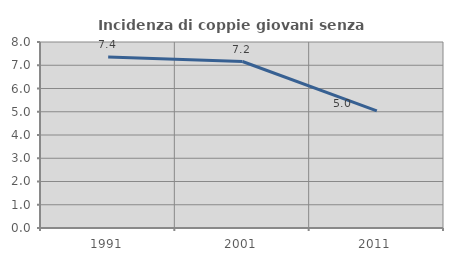
| Category | Incidenza di coppie giovani senza figli |
|---|---|
| 1991.0 | 7.36 |
| 2001.0 | 7.16 |
| 2011.0 | 5.039 |